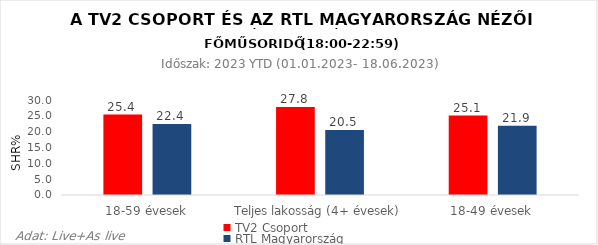
| Category | TV2 Csoport | RTL Magyarország |
|---|---|---|
| 18-59 évesek | 25.4 | 22.4 |
| Teljes lakosság (4+ évesek) | 27.8 | 20.5 |
| 18-49 évesek | 25.1 | 21.9 |